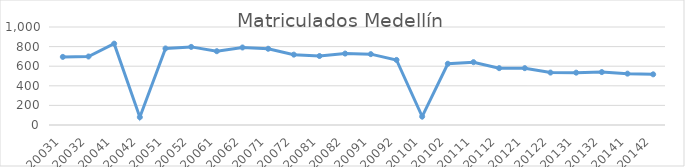
| Category | Matriculados Medellín |
|---|---|
| 20031 | 695 |
| 20032 | 699 |
| 20041 | 830 |
| 20042 | 80 |
| 20051 | 781 |
| 20052 | 797 |
| 20061 | 753 |
| 20062 | 791 |
| 20071 | 778 |
| 20072 | 718 |
| 20081 | 704 |
| 20082 | 729 |
| 20091 | 723 |
| 20092 | 664 |
| 20101 | 86 |
| 20102 | 625 |
| 20111 | 641 |
| 20112 | 580 |
| 20121 | 580 |
| 20122 | 535 |
| 20131 | 534 |
| 20132 | 540 |
| 20141 | 524 |
| 20142 | 517 |